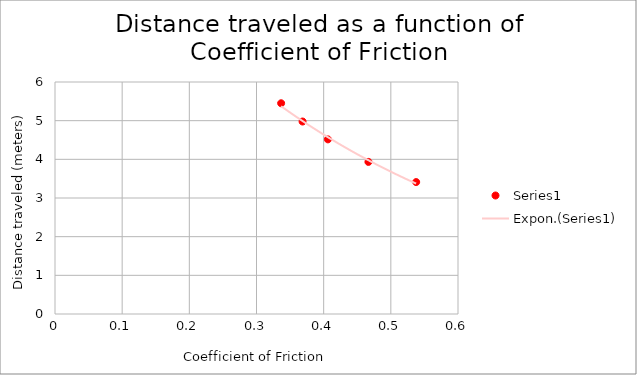
| Category | Series 0 |
|---|---|
| 0.406326 | 4.516 |
| 0.537753 | 3.412 |
| 0.466649 | 3.933 |
| 0.336677 | 5.45 |
| 0.368597 | 4.978 |